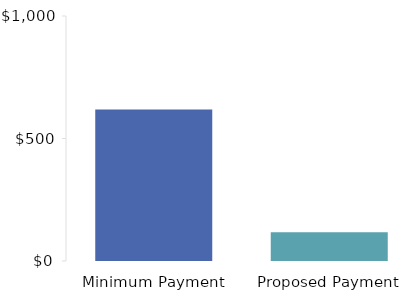
| Category | Series 0 |
|---|---|
| 0 | 618.429 |
| 1 | 117.786 |